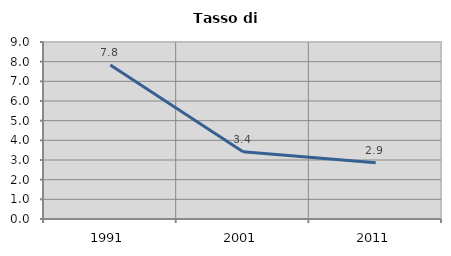
| Category | Tasso di disoccupazione   |
|---|---|
| 1991.0 | 7.826 |
| 2001.0 | 3.415 |
| 2011.0 | 2.86 |